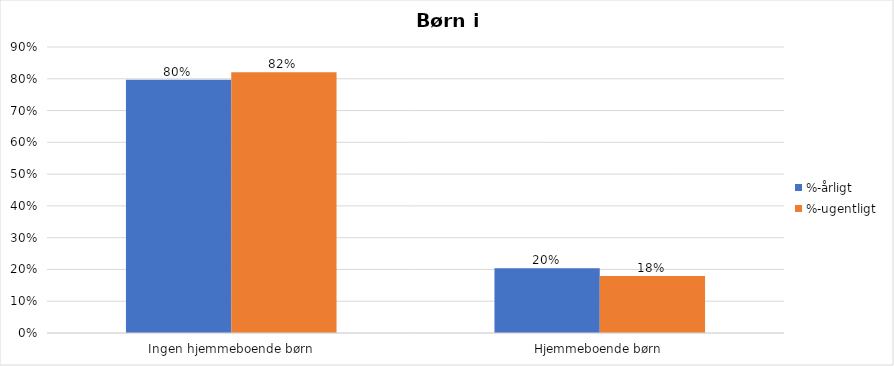
| Category | %-årligt | %-ugentligt |
|---|---|---|
| Ingen hjemmeboende børn | 0.797 | 0.82 |
| Hjemmeboende børn | 0.203 | 0.18 |